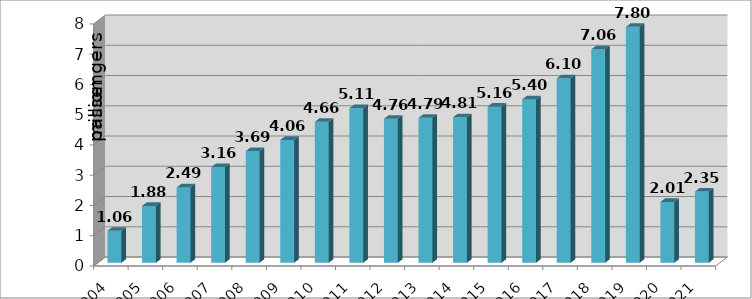
| Category | Series 0 |
|---|---|
| 2004.0 | 1.06 |
| 2005.0 | 1.88 |
| 2006.0 | 2.49 |
| 2007.0 | 3.16 |
| 2008.0 | 3.69 |
| 2009.0 | 4.06 |
| 2010.0 | 4.66 |
| 2011.0 | 5.11 |
| 2012.0 | 4.76 |
| 2013.0 | 4.79 |
| 2014.0 | 4.81 |
| 2015.0 | 5.16 |
| 2016.0 | 5.4 |
| 2017.0 | 6.1 |
| 2018.0 | 7.056 |
| 2019.0 | 7.797 |
| 2020.0 | 2.011 |
| 2021.0 | 2.353 |